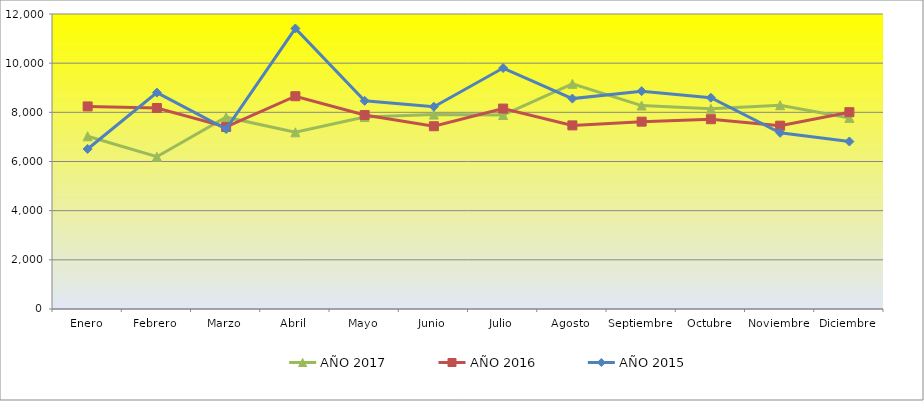
| Category | AÑO 2017 | AÑO 2016 | AÑO 2015 |
|---|---|---|---|
| Enero | 7024.675 | 8240 | 6510 |
| Febrero | 6194.805 | 8176 | 8802 |
| Marzo | 7801.948 | 7405 | 7320 |
| Abril | 7188.312 | 8655 | 11412 |
| Mayo | 7807.792 | 7890 | 8468 |
| Junio | 7907.143 | 7434 | 8229 |
| Julio | 7889.61 | 8153 | 9801 |
| Agosto | 9157.792 | 7469 | 8559 |
| Septiembre | 8275.325 | 7621 | 8861 |
| Octubre | 8142.013 | 7720 | 8594 |
| Noviembre | 8289.937 | 7457 | 7165 |
| Diciembre | 7772.727 | 8006 | 6814 |